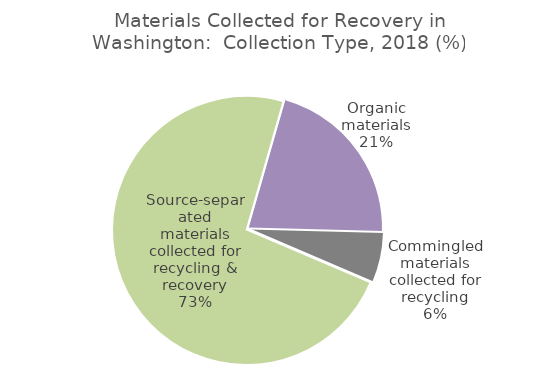
| Category | Series 0 |
|---|---|
| Organic materials | 2242289 |
| Commingled materials collected for recycling | 643165 |
| Source-separated materials collected for recycling & recovery | 7810965 |